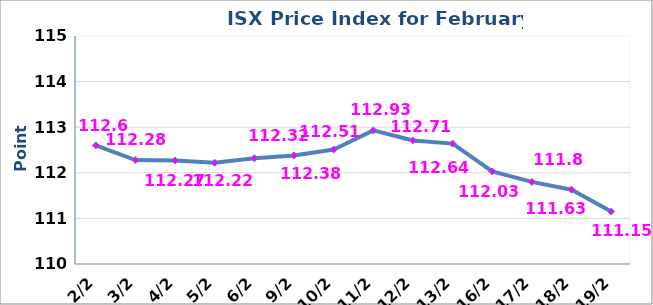
| Category | 2014 |
|---|---|
|  2/2 | 112.6 |
|  3/2 | 112.28 |
|  4/2 | 112.27 |
|  5/2 | 112.22 |
|  6/2 | 112.32 |
|  9/2 | 112.38 |
|  10/2 | 112.51 |
|  11/2 | 112.93 |
|  12/2 | 112.71 |
|  13/2 | 112.64 |
|  16/2 | 112.03 |
|  17/2 | 111.8 |
|  18/2 | 111.63 |
|  19/2 | 111.15 |